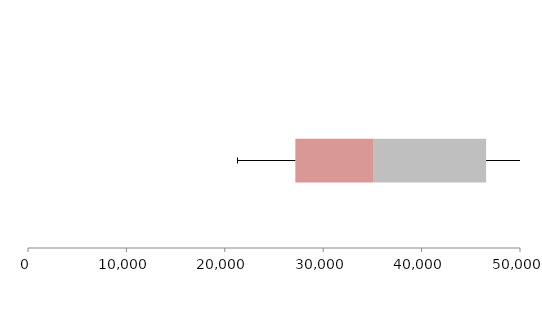
| Category | Series 1 | Series 2 | Series 3 |
|---|---|---|---|
| 0 | 27169.705 | 7893.343 | 11494.208 |